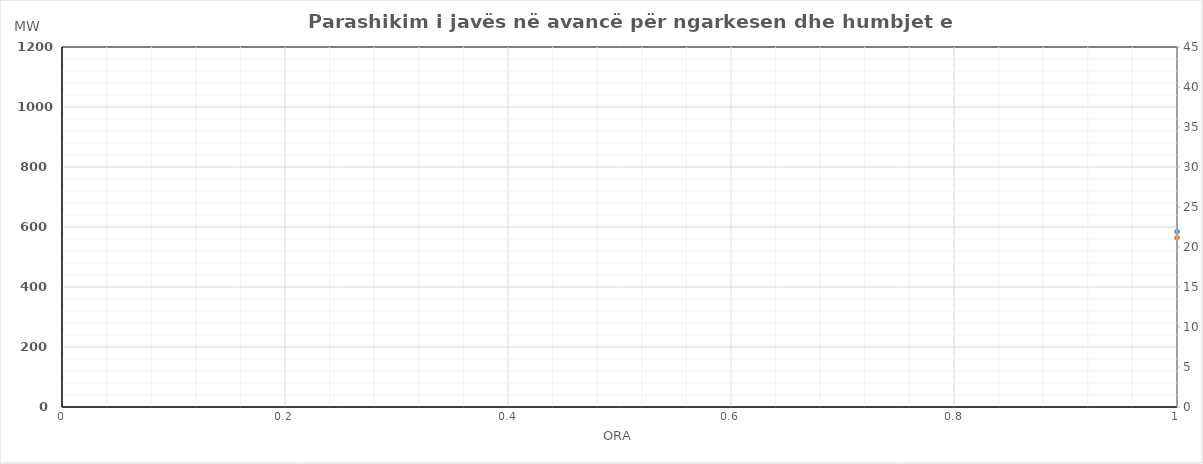
| Category | Ngarkesa (MWh) |
|---|---|
| 0 | 564.14 |
| 1 | 511.62 |
| 2 | 489.2 |
| 3 | 482.12 |
| 4 | 489.38 |
| 5 | 532.66 |
| 6 | 643.26 |
| 7 | 786.51 |
| 8 | 833.45 |
| 9 | 837.65 |
| 10 | 786.69 |
| 11 | 768.25 |
| 12 | 749.96 |
| 13 | 787.62 |
| 14 | 812.06 |
| 15 | 807.36 |
| 16 | 793.62 |
| 17 | 819.03 |
| 18 | 858.68 |
| 19 | 908.02 |
| 20 | 971.18 |
| 21 | 917.8 |
| 22 | 820.9 |
| 23 | 702.87 |
| 24 | 598.02 |
| 25 | 548.45 |
| 26 | 523.64 |
| 27 | 514.74 |
| 28 | 522.75 |
| 29 | 564.91 |
| 30 | 673.99 |
| 31 | 817.35 |
| 32 | 874.26 |
| 33 | 874.95 |
| 34 | 818.58 |
| 35 | 747.06 |
| 36 | 730.81 |
| 37 | 746.26 |
| 38 | 768.08 |
| 39 | 770.31 |
| 40 | 770.11 |
| 41 | 789.25 |
| 42 | 820.05 |
| 43 | 860.34 |
| 44 | 937.43 |
| 45 | 893.42 |
| 46 | 789.81 |
| 47 | 671.91 |
| 48 | 581.51 |
| 49 | 527.03 |
| 50 | 506.03 |
| 51 | 497.23 |
| 52 | 506.01 |
| 53 | 544.64 |
| 54 | 650.77 |
| 55 | 796.49 |
| 56 | 847.09 |
| 57 | 845.58 |
| 58 | 791.91 |
| 59 | 775.55 |
| 60 | 764.43 |
| 61 | 772.95 |
| 62 | 803.68 |
| 63 | 803.73 |
| 64 | 792.93 |
| 65 | 821.02 |
| 66 | 846.32 |
| 67 | 885.13 |
| 68 | 946.67 |
| 69 | 900.68 |
| 70 | 801.4 |
| 71 | 689.1 |
| 72 | 588.13 |
| 73 | 537.21 |
| 74 | 515.91 |
| 75 | 507.7 |
| 76 | 515.5 |
| 77 | 556.44 |
| 78 | 661.59 |
| 79 | 796.99 |
| 80 | 838.19 |
| 81 | 826.76 |
| 82 | 700.08 |
| 83 | 696.44 |
| 84 | 747.54 |
| 85 | 754.34 |
| 86 | 785.12 |
| 87 | 774.8 |
| 88 | 782.02 |
| 89 | 803.33 |
| 90 | 827.53 |
| 91 | 860.56 |
| 92 | 937.73 |
| 93 | 900.53 |
| 94 | 796.21 |
| 95 | 673.82 |
| 96 | 581.73 |
| 97 | 532.61 |
| 98 | 512.01 |
| 99 | 504.3 |
| 100 | 510.9 |
| 101 | 549.74 |
| 102 | 659.29 |
| 103 | 792.99 |
| 104 | 827.69 |
| 105 | 815.96 |
| 106 | 751.98 |
| 107 | 741.24 |
| 108 | 727.04 |
| 109 | 738.14 |
| 110 | 772.72 |
| 111 | 760 |
| 112 | 762.02 |
| 113 | 788.33 |
| 114 | 819.63 |
| 115 | 854.46 |
| 116 | 927.43 |
| 117 | 890.53 |
| 118 | 788.31 |
| 119 | 668.32 |
| 120 | 584.03 |
| 121 | 537.62 |
| 122 | 524.13 |
| 123 | 522.23 |
| 124 | 525.33 |
| 125 | 558.55 |
| 126 | 654.23 |
| 127 | 768.81 |
| 128 | 854.54 |
| 129 | 872.04 |
| 130 | 854.27 |
| 131 | 847.65 |
| 132 | 849.62 |
| 133 | 847.43 |
| 134 | 830.13 |
| 135 | 801.06 |
| 136 | 799.14 |
| 137 | 816.46 |
| 138 | 844.26 |
| 139 | 874.5 |
| 140 | 943.34 |
| 141 | 888.94 |
| 142 | 775.27 |
| 143 | 682.67 |
| 144 | 590.93 |
| 145 | 542.42 |
| 146 | 520.13 |
| 147 | 510.73 |
| 148 | 514.73 |
| 149 | 536.65 |
| 150 | 602.13 |
| 151 | 698.01 |
| 152 | 787.34 |
| 153 | 836.04 |
| 154 | 850.97 |
| 155 | 866.25 |
| 156 | 867.12 |
| 157 | 836.73 |
| 158 | 804.13 |
| 159 | 780.06 |
| 160 | 789.84 |
| 161 | 809.36 |
| 162 | 842.16 |
| 163 | 880.4 |
| 164 | 941.34 |
| 165 | 908.44 |
| 166 | 796.77 |
| 167 | 674.97 |